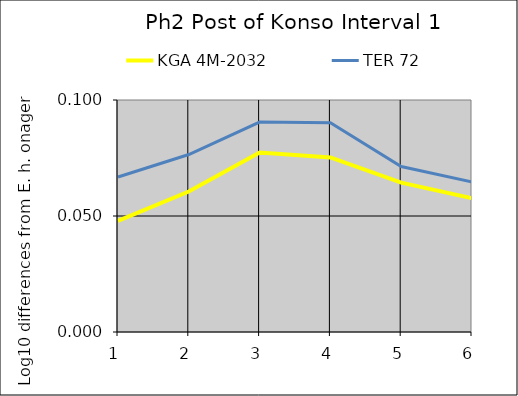
| Category | KGA 4M-2032 | TER 72 |
|---|---|---|
| 1.0 | 0.048 | 0.067 |
| 2.0 | 0.061 | 0.077 |
| 3.0 | 0.077 | 0.09 |
| 4.0 | 0.075 | 0.09 |
| 5.0 | 0.064 | 0.071 |
| 6.0 | 0.058 | 0.065 |